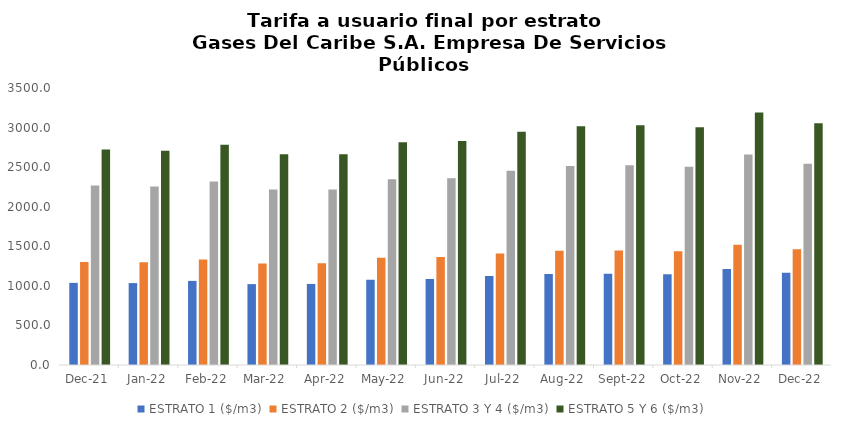
| Category | ESTRATO 1 ($/m3) | ESTRATO 2 ($/m3) | ESTRATO 3 Y 4 ($/m3) | ESTRATO 5 Y 6 ($/m3) |
|---|---|---|---|---|
| 2021-12-01 | 1037.76 | 1301.16 | 2269.54 | 2723.448 |
| 2022-01-01 | 1034.96 | 1299.58 | 2255.09 | 2706.108 |
| 2022-02-01 | 1062.79 | 1333.18 | 2319.47 | 2783.364 |
| 2022-03-01 | 1022.16 | 1282.17 | 2218.76 | 2662.512 |
| 2022-04-01 | 1024.32 | 1285.33 | 2218.09 | 2661.708 |
| 2022-05-01 | 1078.73 | 1354.26 | 2345.47 | 2814.564 |
| 2022-06-01 | 1086.51 | 1364.12 | 2359 | 2830.8 |
| 2022-07-01 | 1123.27 | 1408.66 | 2455.61 | 2946.732 |
| 2022-08-01 | 1149.36 | 1442.77 | 2514.15 | 3016.98 |
| 2022-09-01 | 1154.32 | 1447.01 | 2525.28 | 3030.336 |
| 2022-10-01 | 1146.18 | 1437.12 | 2503.54 | 3004.248 |
| 2022-11-01 | 1212.06 | 1519.44 | 2658.31 | 3189.972 |
| 2022-12-01 | 1166.58 | 1463.43 | 2544.24 | 3053.088 |